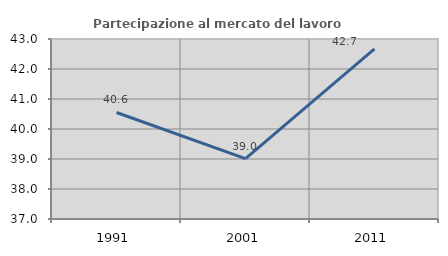
| Category | Partecipazione al mercato del lavoro  femminile |
|---|---|
| 1991.0 | 40.55 |
| 2001.0 | 39.013 |
| 2011.0 | 42.672 |